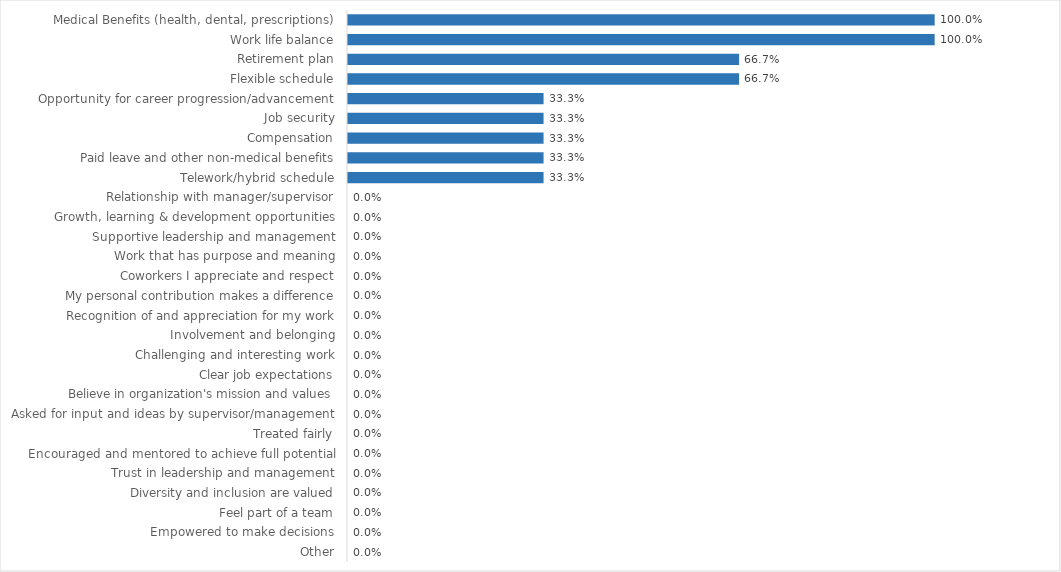
| Category | Enhanced 911 Board |
|---|---|
| Medical Benefits (health, dental, prescriptions) | 1 |
| Work life balance | 1 |
| Retirement plan | 0.667 |
| Flexible schedule | 0.667 |
| Opportunity for career progression/advancement | 0.333 |
| Job security | 0.333 |
| Compensation | 0.333 |
| Paid leave and other non-medical benefits | 0.333 |
| Telework/hybrid schedule | 0.333 |
| Relationship with manager/supervisor | 0 |
| Growth, learning & development opportunities | 0 |
| Supportive leadership and management | 0 |
| Work that has purpose and meaning | 0 |
| Coworkers I appreciate and respect | 0 |
| My personal contribution makes a difference | 0 |
| Recognition of and appreciation for my work | 0 |
| Involvement and belonging | 0 |
| Challenging and interesting work | 0 |
| Clear job expectations | 0 |
| Believe in organization's mission and values | 0 |
| Asked for input and ideas by supervisor/management | 0 |
| Treated fairly | 0 |
| Encouraged and mentored to achieve full potential | 0 |
| Trust in leadership and management | 0 |
| Diversity and inclusion are valued | 0 |
| Feel part of a team | 0 |
| Empowered to make decisions | 0 |
| Other | 0 |